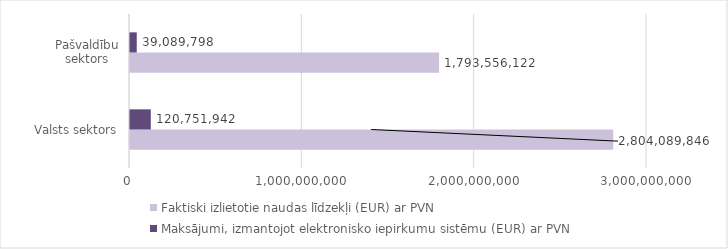
| Category | Faktiski izlietotie naudas līdzekļi (EUR) ar PVN | Maksājumi, izmantojot elektronisko iepirkumu sistēmu (EUR) ar PVN |
|---|---|---|
| Valsts sektors | 2804089846 | 120751942 |
| Pašvaldību sektors | 1793556122 | 39089798 |